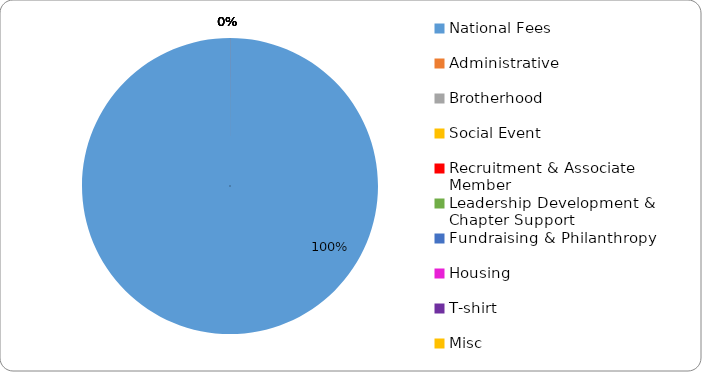
| Category | Expenses by Category |
|---|---|
| National Fees | 850 |
| Administrative | 0 |
| Brotherhood | 0 |
| Social Event | 0 |
| Recruitment & Associate Member | 0 |
| Leadership Development & Chapter Support | 0 |
| Fundraising & Philanthropy  | 0 |
| Housing | 0 |
| T-shirt | 0 |
| Misc | 0 |